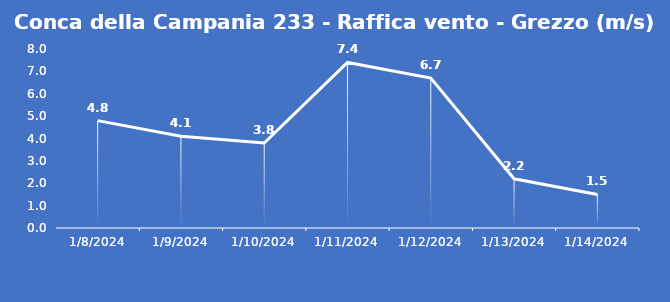
| Category | Conca della Campania 233 - Raffica vento - Grezzo (m/s) |
|---|---|
| 1/8/24 | 4.8 |
| 1/9/24 | 4.1 |
| 1/10/24 | 3.8 |
| 1/11/24 | 7.4 |
| 1/12/24 | 6.7 |
| 1/13/24 | 2.2 |
| 1/14/24 | 1.5 |